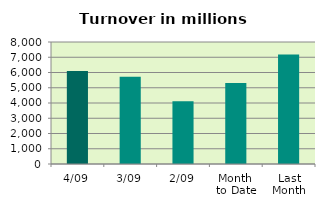
| Category | Series 0 |
|---|---|
| 4/09 | 6100.33 |
| 3/09 | 5714.414 |
| 2/09 | 4117.167 |
| Month 
to Date | 5310.637 |
| Last
Month | 7181.07 |